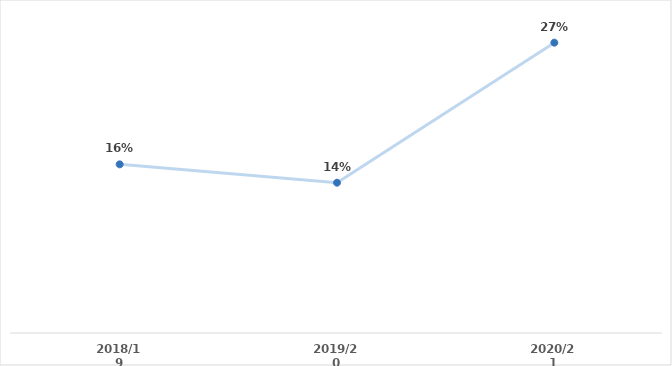
| Category | Series 0 |
|---|---|
| 2018/19 | 0.157 |
| 2019/20 | 0.14 |
| 2020/21 | 0.27 |